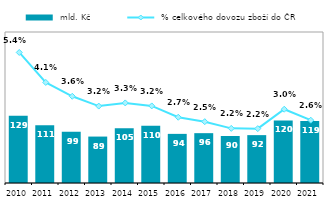
| Category |  mld. Kč |
|---|---|
| 2010.0 | 129.258 |
| 2011.0 | 110.978 |
| 2012.0 | 98.539 |
| 2013.0 | 89.173 |
| 2014.0 | 105.192 |
| 2015.0 | 110.049 |
| 2016.0 | 94.346 |
| 2017.0 | 95.711 |
| 2018.0 | 90.251 |
| 2019.0 | 91.931 |
| 2020.0 | 120.086 |
| 2021.0 | 118.976 |